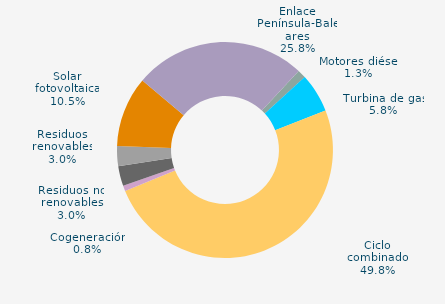
| Category | Series 0 |
|---|---|
| Carbón | 0 |
| Motores diésel | 1.267 |
| Turbina de gas | 5.813 |
| Ciclo combinado | 49.777 |
| Generación auxiliar | 0 |
| Cogeneración | 0.812 |
| Residuos no renovables | 2.99 |
| Residuos renovables | 2.99 |
| Eólica | 0 |
| Solar fotovoltaica | 10.545 |
| Otras renovables | 0.009 |
| Enlace Península-Baleares | 25.796 |